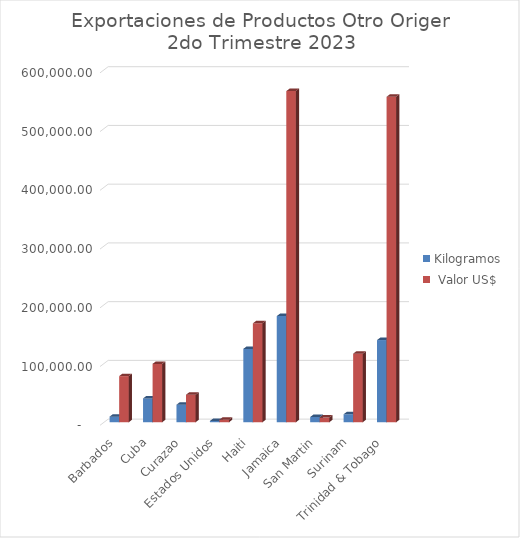
| Category | Kilogramos |  Valor US$ |
|---|---|---|
| Barbados | 9543.55 | 78545.4 |
| Cuba | 40510.89 | 99308 |
| Curazao | 29856.3 | 46865.25 |
| Estados Unidos | 2139.36 | 4392.27 |
| Haiti | 124832.99 | 168435.1 |
| Jamaica | 180713.02 | 563760.1 |
| San Martin | 8884.8 | 7958.4 |
| Surinam | 13576.32 | 116705.73 |
| Trinidad & Tobago | 139918.43 | 554110.44 |